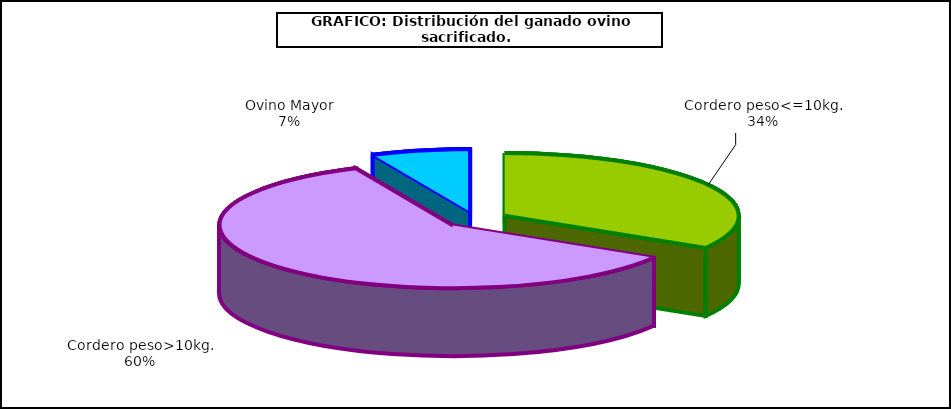
| Category | Series 0 |
|---|---|
| 0 | 3300962 |
| 1 | 5860838 |
| 2 | 671326 |